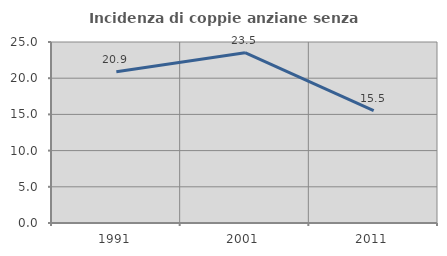
| Category | Incidenza di coppie anziane senza figli  |
|---|---|
| 1991.0 | 20.903 |
| 2001.0 | 23.529 |
| 2011.0 | 15.512 |